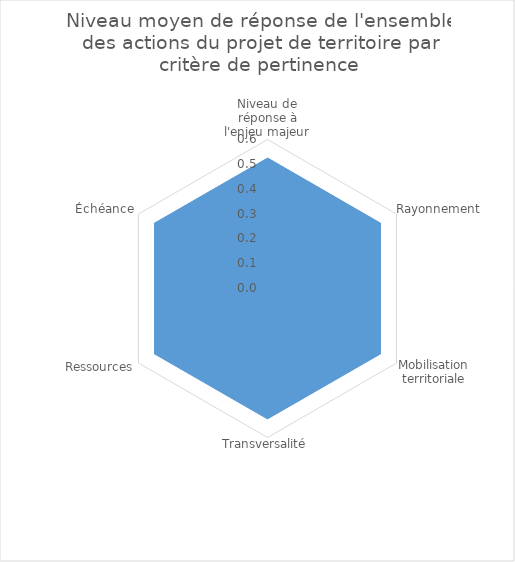
| Category | Series 2 | Series 3 | Series 1 | Series 0 |
|---|---|---|---|---|
| Niveau de réponse à l'enjeu majeur | 0.52 | 0.52 | 0.52 | 0.52 |
| Rayonnement  | 0.52 | 0.52 | 0.52 | 0.52 |
| Mobilisation territoriale | 0.52 | 0.52 | 0.52 | 0.52 |
| Transversalité | 0.52 | 0.52 | 0.52 | 0.52 |
| Ressources | 0.52 | 0.52 | 0.52 | 0.52 |
| Échéance | 0.52 | 0.52 | 0.52 | 0.52 |